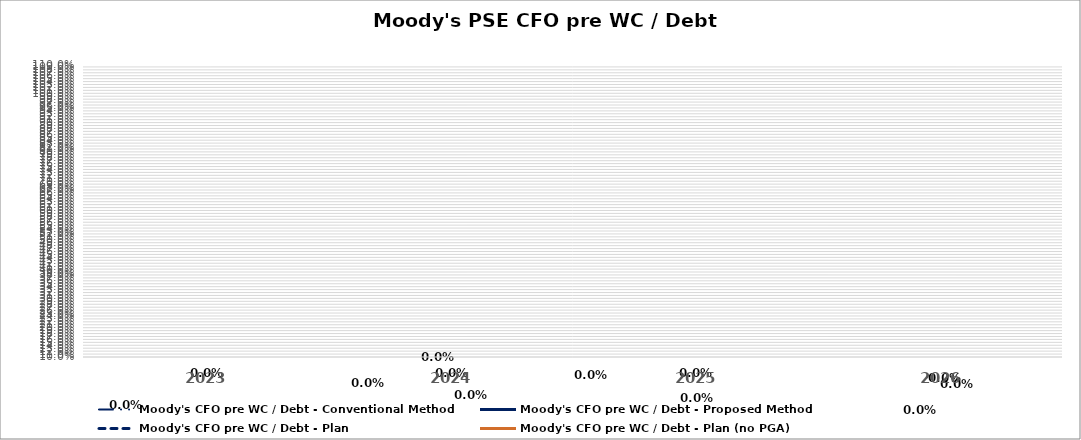
| Category | Moody's CFO pre WC / Debt - Conventional Method | Moody's CFO pre WC / Debt - Proposed Method | Moody's CFO pre WC / Debt - Plan | Moody's CFO pre WC / Debt - Plan (no PGA) |
|---|---|---|---|---|
| 2023.0 | 0 | 0 | 0 | 0 |
| 2024.0 | 0 | 0 | 0 | 0 |
| 2025.0 | 0 | 0 | 0 | 0 |
| 2026.0 | 0 | 0 | 0 | 0 |